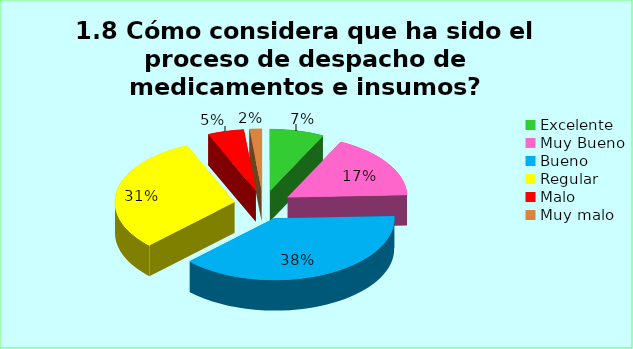
| Category | Series 0 |
|---|---|
| Excelente | 0.073 |
| Muy Bueno | 0.171 |
| Bueno  | 0.382 |
| Regular  | 0.309 |
| Malo  | 0.049 |
| Muy malo  | 0.016 |